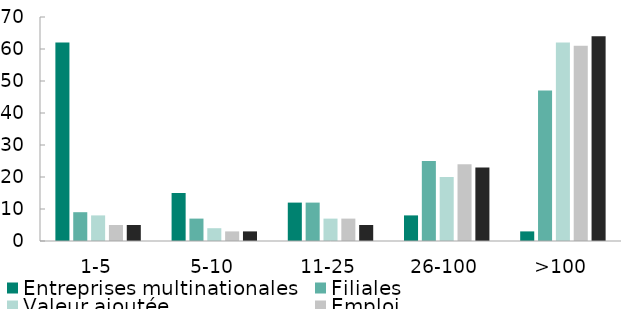
| Category | Entreprises multinationales | Filiales | Valeur ajoutée | Emploi | Actifs totaux |
|---|---|---|---|---|---|
| 1-5 | 62 | 9 | 8 | 5 | 5 |
| 5-10 | 15 | 7 | 4 | 3 | 3 |
| 11-25 | 12 | 12 | 7 | 7 | 5 |
| 26-100 | 8 | 25 | 20 | 24 | 23 |
| >100 | 3 | 47 | 62 | 61 | 64 |